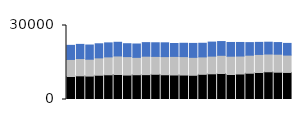
| Category | Item2 Online | Item2 Store | Item2 Phone |
|---|---|---|---|
| 0 | 9325 | 6915 | 5711 |
| 1 | 9596 | 6999 | 5748 |
| 2 | 9494 | 6838 | 5757 |
| 3 | 9838 | 7038 | 5715 |
| 4 | 10022 | 7257 | 5678 |
| 5 | 10146 | 7500 | 5549 |
| 6 | 9901 | 7484 | 5232 |
| 7 | 10039 | 7050 | 5410 |
| 8 | 10076 | 7476 | 5506 |
| 9 | 10223 | 7251 | 5526 |
| 10 | 10033 | 7352 | 5596 |
| 11 | 9938 | 7528 | 5237 |
| 12 | 9916 | 7468 | 5411 |
| 13 | 9822 | 7270 | 5645 |
| 14 | 10210 | 7060 | 5529 |
| 15 | 10415 | 7164 | 5695 |
| 16 | 10551 | 7366 | 5574 |
| 17 | 10135 | 7416 | 5571 |
| 18 | 10339 | 7282 | 5503 |
| 19 | 10655 | 7304 | 5105 |
| 20 | 10942 | 7329 | 4885 |
| 21 | 11239 | 7204 | 4784 |
| 22 | 11064 | 7296 | 4727 |
| 23 | 10966 | 7038 | 4739 |